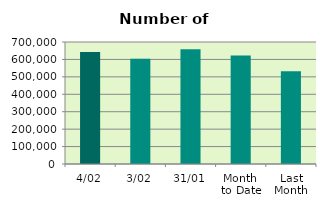
| Category | Series 0 |
|---|---|
| 4/02 | 642540 |
| 3/02 | 603684 |
| 31/01 | 659080 |
| Month 
to Date | 623112 |
| Last
Month | 532699.545 |